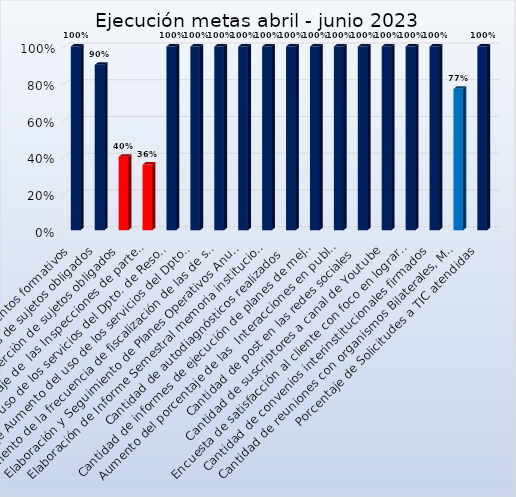
| Category | Series 0 |
|---|---|
| Cantidad de eventos formativos | 1 |
| Aumento expedición de licencias de sujetos obligados | 0.9 |
| Aumento el porcentaje inserciòn de sujetos obligados  | 0.4 |
| Aumento de Porcentaje de  las Inspecciones de parte y oficio | 0.357 |
| Frecuencia del uso de los servicios del Dpto. de Resolución Alternativa de Conflictos | 1 |
| Porcentaje Aumento del uso de los servicios del Dpto. Orientación y Asistencia Jurídica | 1 |
| Aumento de la frecuencia de fiscalización de las de sociedades de gestión  colectiva. | 1 |
| Elaboración y Seguimiento de Planes Operativos Anuales | 1 |
| Elaboración de Informe Semestral memoria institucional. | 1 |
| Cantidad de autodiagnósticos realizados  | 1 |
| Cantidad de informes de ejecución de planes de mejora al año | 1 |
| Aumento del porcentaje de las  Interacciones en publicaciones digitales | 1 |
| Cantidad de post en las redes sociales  | 1 |
| Cantidad de suscriptores a canal de Youtube | 1 |
| Encuesta de satisfacción al cliente con foco en lograr el 95% de satisfacción  | 1 |
| Cantidad de convenios interinstitucionales firmados | 1 |
| Cantidad de reuniones con organismos Bilaterales, Multilaterales e Instituciones homólogas a la ONDA   | 0.769 |
| Porcentaje de Solicitudes a TIC atendidas | 1 |